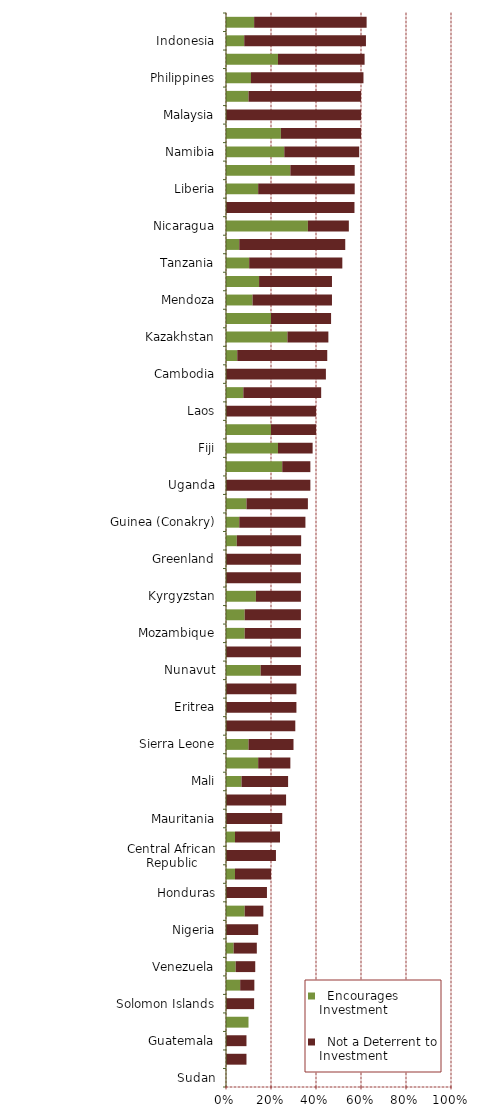
| Category |   Encourages Investment |   Not a Deterrent to Investment |
|---|---|---|
| Sudan | 0 | 0 |
| South Sudan | 0 | 0.091 |
| Guatemala | 0 | 0.091 |
| Angola | 0.1 | 0 |
| Solomon Islands | 0 | 0.125 |
| Mongolia | 0.063 | 0.063 |
| Venezuela | 0.043 | 0.087 |
| Democratic Republic of Congo (DRC) | 0.034 | 0.103 |
| Nigeria | 0 | 0.143 |
| Dominican Republic | 0.083 | 0.083 |
| Honduras | 0 | 0.182 |
| Ecuador | 0.04 | 0.16 |
| Central African Republic | 0 | 0.222 |
| Papua New Guinea | 0.04 | 0.2 |
| Mauritania | 0 | 0.25 |
| Madagascar | 0 | 0.267 |
| Mali | 0.069 | 0.207 |
| Uruguay | 0.143 | 0.143 |
| Sierra Leone | 0.1 | 0.2 |
| Kenya | 0 | 0.308 |
| Eritrea | 0 | 0.313 |
| Niger | 0 | 0.313 |
| Nunavut | 0.154 | 0.179 |
| Egypt | 0 | 0.333 |
| Mozambique | 0.083 | 0.25 |
| Zimbabwe | 0.083 | 0.25 |
| Kyrgyzstan | 0.133 | 0.2 |
| Myanmar | 0 | 0.333 |
| Greenland | 0 | 0.333 |
| Ivory Coast | 0.048 | 0.286 |
| Guinea (Conakry) | 0.059 | 0.294 |
| Ethiopia | 0.091 | 0.273 |
| Uganda | 0 | 0.375 |
| French Guiana | 0.25 | 0.125 |
| Fiji | 0.231 | 0.154 |
| Lesotho | 0.2 | 0.2 |
| Laos | 0 | 0.4 |
| Burkina Faso | 0.077 | 0.346 |
| Cambodia | 0 | 0.444 |
| Bolivia | 0.05 | 0.4 |
| Kazakhstan | 0.273 | 0.182 |
| Guyana | 0.2 | 0.267 |
| Mendoza | 0.118 | 0.353 |
| Colombia | 0.147 | 0.324 |
| Tanzania | 0.103 | 0.414 |
| Santa Cruz | 0.059 | 0.471 |
| Nicaragua | 0.364 | 0.182 |
| Suriname | 0 | 0.571 |
| Liberia | 0.143 | 0.429 |
| Russia | 0.286 | 0.286 |
| Namibia | 0.259 | 0.333 |
| Northwest Territories | 0.244 | 0.356 |
| Malaysia | 0 | 0.6 |
| La Rioja | 0.1 | 0.5 |
| Philippines | 0.111 | 0.5 |
| Rio Negro | 0.231 | 0.385 |
| Indonesia | 0.081 | 0.541 |
| Panama | 0.125 | 0.5 |